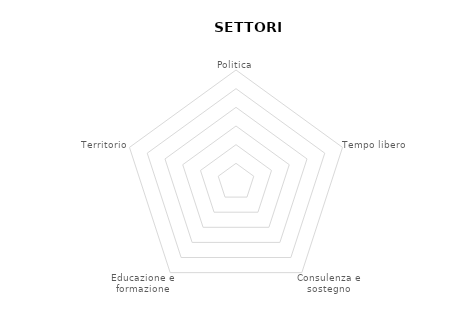
| Category | Series 0 |
|---|---|
| Politica | 0 |
| Tempo libero | 0 |
| Consulenza e sostegno | 0 |
| Educazione e formazione | 0 |
| Territorio | 0 |